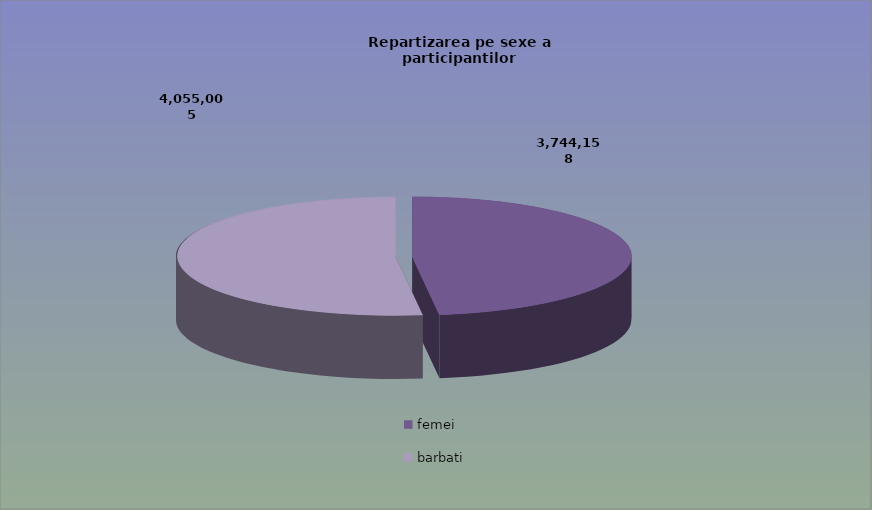
| Category | Series 0 |
|---|---|
| femei | 3744158 |
| barbati | 4055005 |